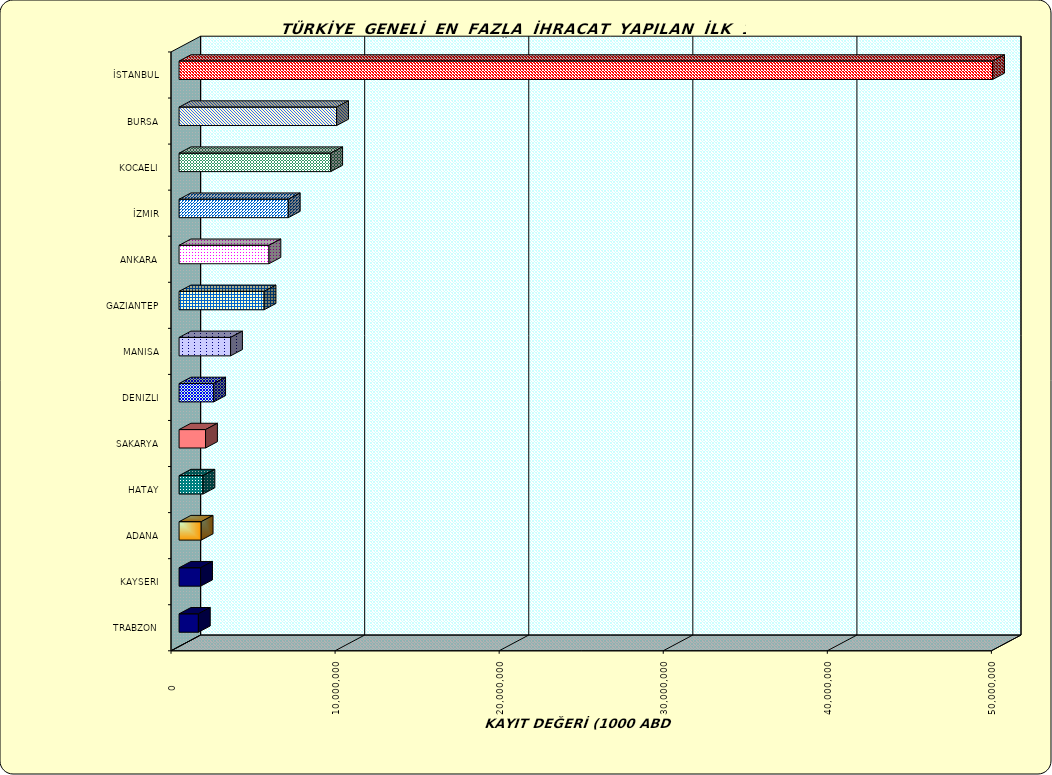
| Category | Series 0 |
|---|---|
| İSTANBUL | 49583108.317 |
| BURSA | 9602177.67 |
| KOCAELI | 9243517.911 |
| İZMIR | 6657267.919 |
| ANKARA | 5477995.063 |
| GAZIANTEP | 5181244.074 |
| MANISA | 3138406.608 |
| DENIZLI | 2110698.443 |
| SAKARYA | 1613470.319 |
| HATAY | 1457604.271 |
| ADANA | 1347562.315 |
| KAYSERI | 1312540.34 |
| TRABZON | 1176752.496 |